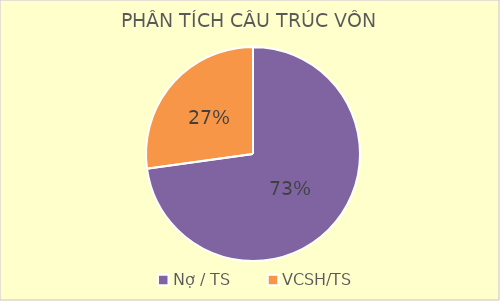
| Category | Series 0 |
|---|---|
| Nợ / TS | 0.728 |
| VCSH/TS | 0.272 |